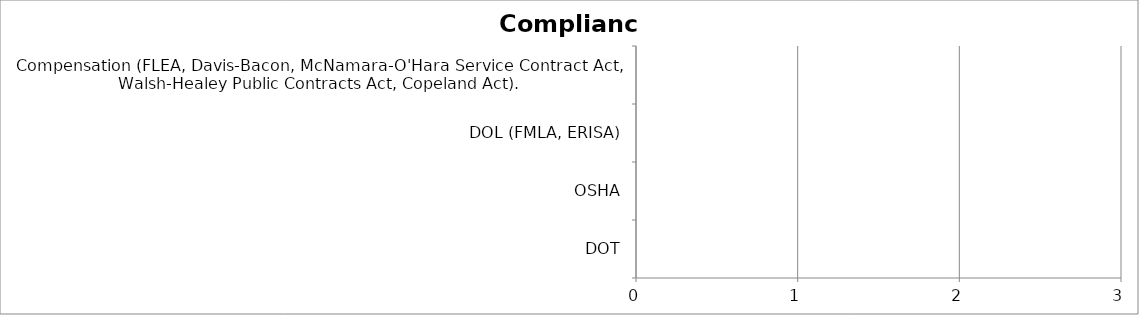
| Category | Low | Medium | High |
|---|---|---|---|
| DOT | 0 | 0 | 0 |
| OSHA | 0 | 0 | 0 |
| DOL (FMLA, ERISA) | 0 | 0 | 0 |
| Compensation (FLEA, Davis-Bacon, McNamara-O'Hara Service Contract Act, Walsh-Healey Public Contracts Act, Copeland Act). | 0 | 0 | 0 |